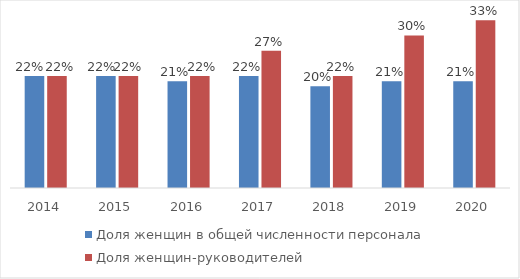
| Category | Доля женщин в общей численности персонала | Доля женщин-руководителей |
|---|---|---|
| 2014.0 | 0.22 | 0.22 |
| 2015.0 | 0.22 | 0.22 |
| 2016.0 | 0.21 | 0.22 |
| 2017.0 | 0.22 | 0.27 |
| 2018.0 | 0.2 | 0.22 |
| 2019.0 | 0.21 | 0.3 |
| 2020.0 | 0.21 | 0.33 |